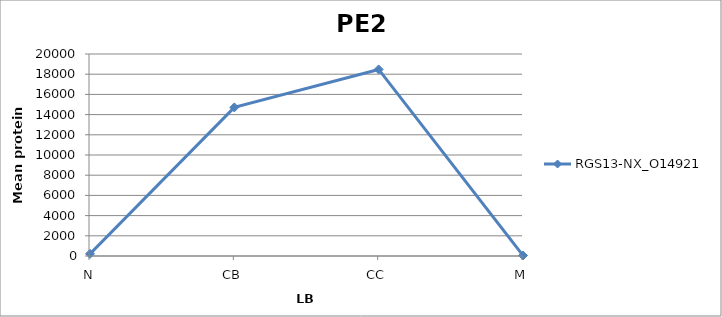
| Category | RGS13-NX_O14921 |
|---|---|
| N | 212.921 |
| CB | 14712.57 |
| CC | 18470.749 |
| M | 49.858 |